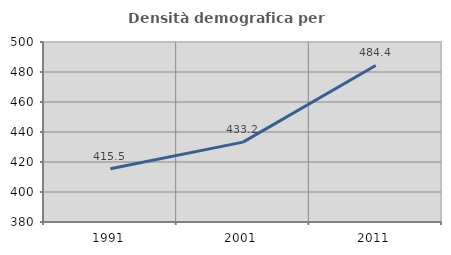
| Category | Densità demografica |
|---|---|
| 1991.0 | 415.503 |
| 2001.0 | 433.247 |
| 2011.0 | 484.357 |